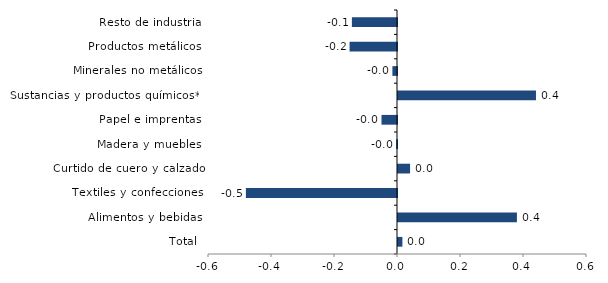
| Category | Series 0 |
|---|---|
| Total | 0.014 |
| Alimentos y bebidas | 0.378 |
| Textiles y confecciones | -0.48 |
| Curtido de cuero y calzado | 0.038 |
| Madera y muebles | -0.003 |
| Papel e imprentas | -0.049 |
| Sustancias y productos químicos** | 0.438 |
| Minerales no metálicos | -0.015 |
| Productos metálicos | -0.151 |
| Resto de industria | -0.143 |